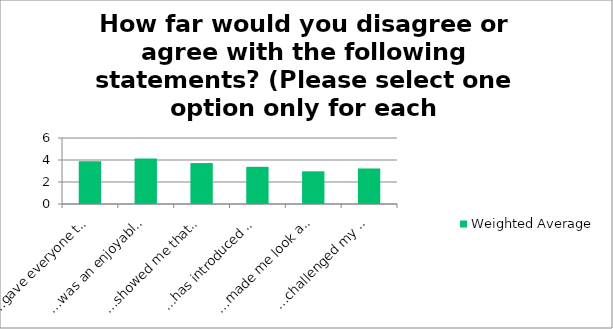
| Category | Weighted Average |
|---|---|
| …gave everyone the chance to share and celebrate together' | 3.88 |
| …was an enjoyable experience' | 4.13 |
| …showed me that there is more to Hull than I expected' | 3.72 |
| ...has introduced me to contemporary circus for the first time' | 3.38 |
| …made me look at Hull's buildings and public spaces in a different way' | 2.97 |
| …challenged my understanding of art' | 3.23 |